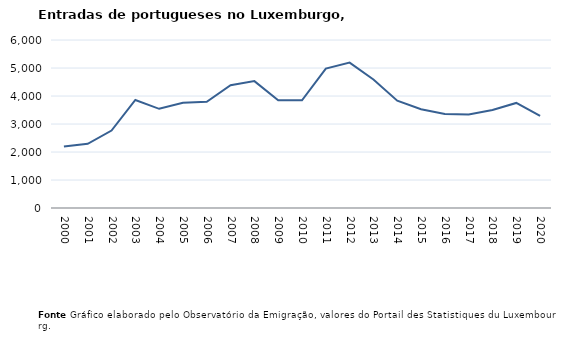
| Category | Entradas |
|---|---|
| 2000.0 | 2193 |
| 2001.0 | 2293 |
| 2002.0 | 2767 |
| 2003.0 | 3857 |
| 2004.0 | 3542 |
| 2005.0 | 3761 |
| 2006.0 | 3796 |
| 2007.0 | 4385 |
| 2008.0 | 4531 |
| 2009.0 | 3844 |
| 2010.0 | 3845 |
| 2011.0 | 4977 |
| 2012.0 | 5193 |
| 2013.0 | 4590 |
| 2014.0 | 3832 |
| 2015.0 | 3525 |
| 2016.0 | 3355 |
| 2017.0 | 3342 |
| 2018.0 | 3501 |
| 2019.0 | 3752 |
| 2020.0 | 3286 |